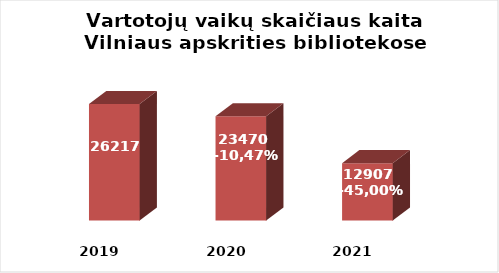
| Category | Series 0 |
|---|---|
| 2019.0 | 26217 |
| 2020.0 | 23470 |
| 2021.0 | 12907 |